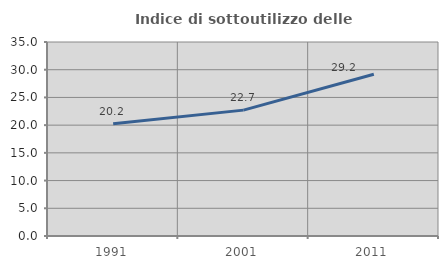
| Category | Indice di sottoutilizzo delle abitazioni  |
|---|---|
| 1991.0 | 20.238 |
| 2001.0 | 22.708 |
| 2011.0 | 29.19 |